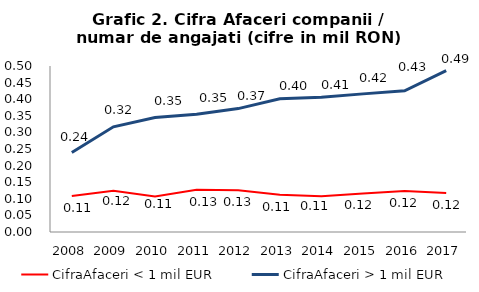
| Category | CifraAfaceri < 1 mil EUR | CifraAfaceri > 1 mil EUR |
|---|---|---|
| 2008.0 | 0.108 | 0.239 |
| 2009.0 | 0.124 | 0.317 |
| 2010.0 | 0.107 | 0.345 |
| 2011.0 | 0.127 | 0.355 |
| 2012.0 | 0.126 | 0.372 |
| 2013.0 | 0.112 | 0.401 |
| 2014.0 | 0.108 | 0.406 |
| 2015.0 | 0.116 | 0.416 |
| 2016.0 | 0.124 | 0.425 |
| 2017.0 | 0.117 | 0.486 |